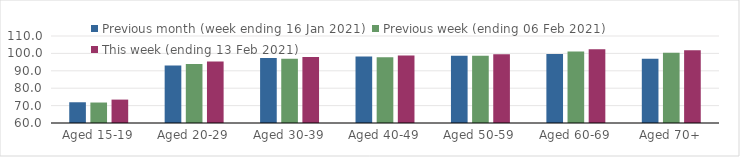
| Category | Previous month (week ending 16 Jan 2021) | Previous week (ending 06 Feb 2021) | This week (ending 13 Feb 2021) |
|---|---|---|---|
| Aged 15-19 | 71.92 | 71.77 | 73.45 |
| Aged 20-29 | 93.05 | 93.89 | 95.36 |
| Aged 30-39 | 97.42 | 96.95 | 97.91 |
| Aged 40-49 | 98.23 | 97.78 | 98.75 |
| Aged 50-59 | 98.63 | 98.6 | 99.58 |
| Aged 60-69 | 99.63 | 101.12 | 102.34 |
| Aged 70+ | 96.96 | 100.39 | 101.85 |